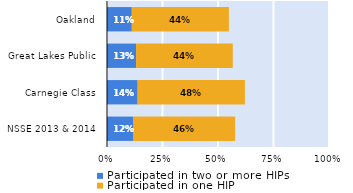
| Category | Participated in two or more HIPs | Participated in one HIP |
|---|---|---|
| NSSE 2013 & 2014 | 0.119 | 0.458 |
| Carnegie Class | 0.138 | 0.483 |
| Great Lakes Public | 0.131 | 0.436 |
| Oakland | 0.112 | 0.437 |